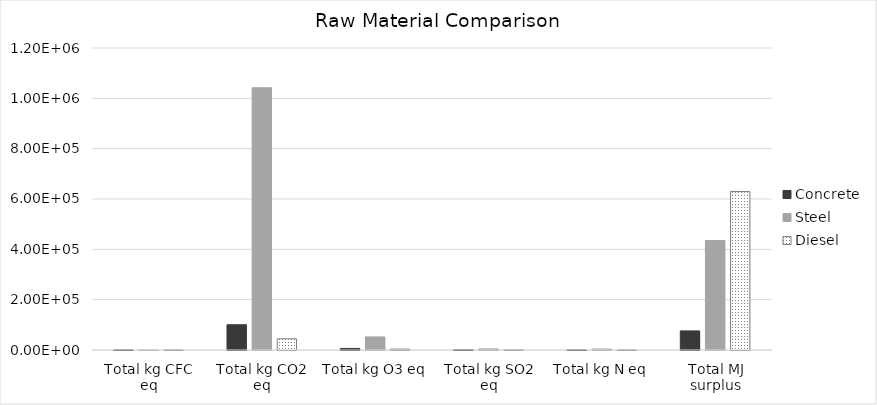
| Category | Concrete | Steel | Diesel |
|---|---|---|---|
| Total kg CFC eq | 0.008 | 0.056 | 0.071 |
| Total kg CO2 eq | 100355.053 | 1042090.57 | 44520.593 |
| Total kg O3 eq | 6170.343 | 51891.436 | 3553.282 |
| Total kg SO2 eq | 323.812 | 4241.433 | 427.389 |
| Total kg N eq | 119.952 | 3723.454 | 141.186 |
| Total MJ surplus | 75865.443 | 434920.253 | 629846.457 |